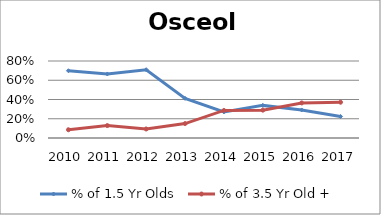
| Category | % of 1.5 Yr Olds | % of 3.5 Yr Old + |
|---|---|---|
| 2010.0 | 0.699 | 0.086 |
| 2011.0 | 0.666 | 0.129 |
| 2012.0 | 0.71 | 0.094 |
| 2013.0 | 0.412 | 0.15 |
| 2014.0 | 0.271 | 0.286 |
| 2015.0 | 0.339 | 0.289 |
| 2016.0 | 0.291 | 0.364 |
| 2017.0 | 0.224 | 0.372 |